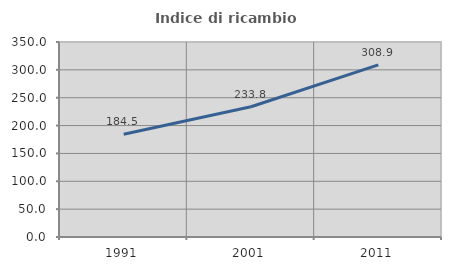
| Category | Indice di ricambio occupazionale  |
|---|---|
| 1991.0 | 184.463 |
| 2001.0 | 233.811 |
| 2011.0 | 308.876 |